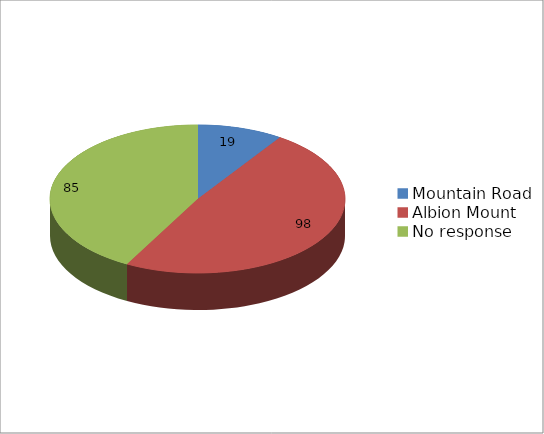
| Category | Series 0 |
|---|---|
| Mountain Road | 19 |
| Albion Mount | 98 |
| No response | 85 |